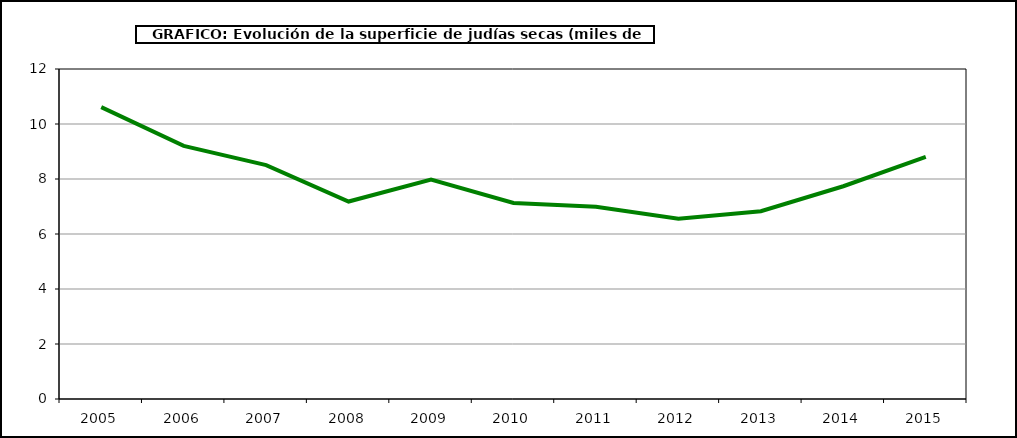
| Category | Superficie |
|---|---|
| 2005.0 | 10.614 |
| 2006.0 | 9.206 |
| 2007.0 | 8.507 |
| 2008.0 | 7.18 |
| 2009.0 | 7.982 |
| 2010.0 | 7.13 |
| 2011.0 | 6.989 |
| 2012.0 | 6.554 |
| 2013.0 | 6.829 |
| 2014.0 | 7.737 |
| 2015.0 | 8.802 |